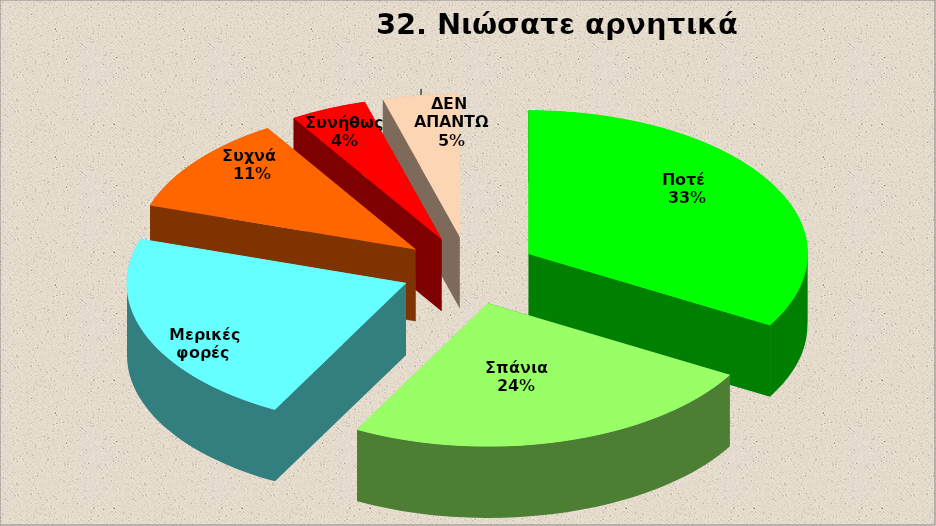
| Category | Series 0 |
|---|---|
| Ποτέ  | 15 |
| Σπάνια  | 11 |
| Μερικές φορές  | 10 |
| Συχνά  | 5 |
| Συνήθως  | 2 |
| ΔΕΝ ΑΠΑΝΤΩ | 2 |